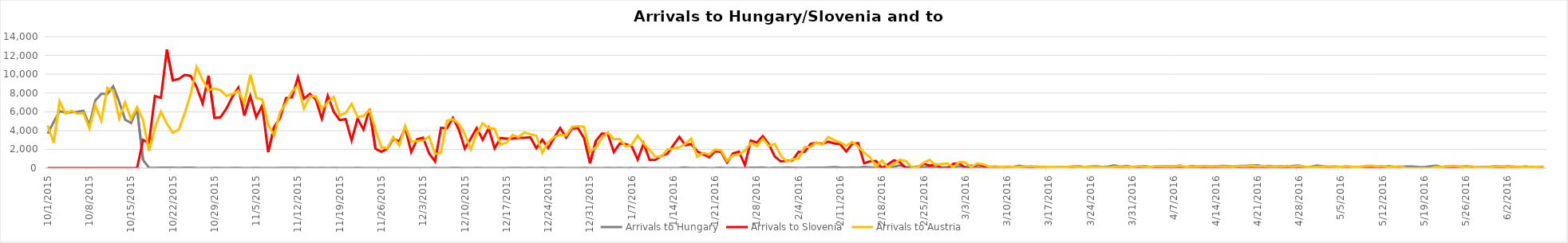
| Category | Arrivals to Hungary | Arrivals to Slovenia | Arrivals to Austria |
|---|---|---|---|
| 10/1/15 | 3667 | 0 | 4550 |
| 10/2/15 | 4897 | 0 | 2700 |
| 10/3/15 | 6056 | 0 | 7100 |
| 10/4/15 | 5925 | 0 | 5800 |
| 10/5/15 | 5952 | 0 | 6100 |
| 10/6/15 | 6000 | 0 | 5800 |
| 10/7/15 | 6103 | 0 | 5861 |
| 10/8/15 | 4583 | 6 | 4229 |
| 10/9/15 | 7215 | 0 | 6700 |
| 10/10/15 | 7907 | 0 | 5050 |
| 10/11/15 | 7897 | 0 | 8540 |
| 10/12/15 | 8702 | 0 | 8240 |
| 10/13/15 | 7081 | 0 | 5280 |
| 10/14/15 | 5157 | 0 | 7000 |
| 10/15/15 | 4808 | 0 | 5235 |
| 10/16/15 | 6353 | 0 | 6500 |
| 10/17/15 | 870 | 3000 | 5155 |
| 10/18/15 | 41 | 2700 | 1822 |
| 10/19/15 | 22 | 7677 | 4300 |
| 10/20/15 | 36 | 7478 | 6017 |
| 10/21/15 | 39 | 12616 | 4737 |
| 10/22/15 | 32 | 9339 | 3767 |
| 10/23/15 | 29 | 9500 | 4092 |
| 10/24/15 | 35 | 9925 | 5841 |
| 10/25/15 | 34 | 9818 | 7882 |
| 10/26/15 | 12 | 8625 | 10784 |
| 10/27/15 | 7 | 6877 | 9390 |
| 10/28/15 | 4 | 9848 | 8336 |
| 10/29/15 | 23 | 5341 | 8473 |
| 10/30/15 | 18 | 5409 | 8302 |
| 10/31/15 | 10 | 6344 | 7691 |
| 11/1/15 | 14 | 7611 | 7887 |
| 11/2/15 | 31 | 8568 | 8243 |
| 11/3/15 | 8 | 5591 | 6900 |
| 11/4/15 | 10 | 7693 | 9930 |
| 11/5/15 | 18 | 5426 | 7478 |
| 11/6/15 | 4 | 6655 | 7315 |
| 11/7/15 | 8 | 1716 | 4648 |
| 11/8/15 | 9 | 4381 | 3465 |
| 11/9/15 | 25 | 5341 | 5962 |
| 11/10/15 | 14 | 7457 | 6933 |
| 11/11/15 | 13 | 7554 | 8169 |
| 11/12/15 | 23 | 9681 | 8777 |
| 11/13/15 | 6 | 7397 | 6351 |
| 11/14/15 | 21 | 7905 | 7659 |
| 11/15/15 | 8 | 7300 | 7632 |
| 11/16/15 | 15 | 5261 | 6319 |
| 11/17/15 | 5 | 7704 | 7026 |
| 11/18/15 | 15 | 5998 | 7577 |
| 11/19/15 | 4 | 5119 | 5635 |
| 11/20/15 | 9 | 5211 | 5865 |
| 11/21/15 | 2 | 2952 | 6836 |
| 11/22/15 | 11 | 5260 | 5446 |
| 11/23/15 | 4 | 4102 | 5546 |
| 11/24/15 | 4 | 6297 | 6204 |
| 11/25/15 | 6 | 2070 | 4122 |
| 11/26/15 | 10 | 1742 | 2211 |
| 11/27/15 | 2 | 2065 | 2120 |
| 11/28/15 | 6 | 3139 | 3320 |
| 11/29/15 | 3 | 2843 | 2407 |
| 11/30/15 | 7 | 4274 | 4482 |
| 12/1/15 | 4 | 1709 | 2821 |
| 12/2/15 | 4 | 3077 | 2874 |
| 12/3/15 | 9 | 3237 | 2935 |
| 12/4/15 | 1 | 1577 | 3366 |
| 12/5/15 | 31 | 715 | 1493 |
| 12/6/15 | 7 | 4288 | 1643 |
| 12/7/15 | 0 | 4240 | 5035 |
| 12/8/15 | 13 | 5351 | 5210 |
| 12/9/15 | 14 | 4103 | 4714 |
| 12/10/15 | 3 | 2078 | 3623 |
| 12/11/15 | 0 | 3149 | 2000 |
| 12/12/15 | 13 | 4271 | 3675 |
| 12/13/15 | 10 | 3016 | 4754 |
| 12/14/15 | 3 | 4250 | 4263 |
| 12/15/15 | 2 | 2098 | 4193 |
| 12/16/15 | 6 | 3214 | 2519 |
| 12/17/15 | 0 | 3135 | 2717 |
| 12/18/15 | 11 | 3150 | 3532 |
| 12/19/15 | 31 | 3222 | 3305 |
| 12/20/15 | 8 | 3233 | 3800 |
| 12/21/15 | 25 | 3278 | 3611 |
| 12/22/15 | 1 | 2118 | 3451 |
| 12/23/15 | 21 | 3030 | 1613 |
| 12/24/15 | 8 | 2131 | 2764 |
| 12/25/15 | 2 | 3257 | 3321 |
| 12/26/15 | 17 | 4274 | 3532 |
| 12/27/15 | 10 | 3253 | 3476 |
| 12/28/15 | 0 | 4228 | 4394 |
| 12/29/15 | 0 | 4239 | 4468 |
| 12/30/15 | 11 | 3195 | 4386 |
| 12/31/15 | 5 | 511 | 1756 |
| 1/1/16 | 0 | 2914 | 2226 |
| 1/2/16 | 0 | 3690 | 3199 |
| 1/3/16 | 17 | 3619 | 3793 |
| 1/4/16 | 3 | 1708 | 3085 |
| 1/5/16 | 18 | 2626 | 3091 |
| 1/6/16 | 5 | 2550 | 2299 |
| 1/7/16 | 31 | 2337 | 2466 |
| 1/8/16 | 7 | 916 | 3472 |
| 1/9/16 | 15 | 2630 | 2619 |
| 1/10/16 | 6 | 880 | 1934 |
| 1/11/16 | 7 | 897 | 1204 |
| 1/12/16 | 2 | 1308 | 1231 |
| 1/13/16 | 5 | 1544 | 1991 |
| 1/14/16 | 4 | 2449 | 2082 |
| 1/15/16 | 14 | 3330 | 2219 |
| 1/16/16 | 65 | 2435 | 2578 |
| 1/17/16 | 11 | 2570 | 3141 |
| 1/18/16 | 9 | 1783 | 1203 |
| 1/19/16 | 29 | 1476 | 1630 |
| 1/20/16 | 10 | 1154 | 1439 |
| 1/21/16 | 13 | 1787 | 1989 |
| 1/22/16 | 47 | 1738 | 1885 |
| 1/23/16 | 10 | 606 | 777 |
| 1/24/16 | 15 | 1564 | 1366 |
| 1/25/16 | 5 | 1746 | 1450 |
| 1/26/16 | 4 | 326 | 1867 |
| 1/27/16 | 36 | 2935 | 2670 |
| 1/28/16 | 51 | 2719 | 2340 |
| 1/29/16 | 69 | 3416 | 3121 |
| 1/30/16 | 6 | 2556 | 2351 |
| 1/31/16 | 39 | 1249 | 2579 |
| 2/1/16 | 31 | 716 | 1367 |
| 2/2/16 | 69 | 765 | 690 |
| 2/3/16 | 46 | 841 | 937 |
| 2/4/16 | 31 | 1733 | 1026 |
| 2/5/16 | 19 | 1713 | 2235 |
| 2/6/16 | 49 | 2580 | 2252 |
| 2/7/16 | 53 | 2694 | 2737 |
| 2/8/16 | 48 | 2582 | 2490 |
| 2/9/16 | 72 | 2805 | 3314 |
| 2/10/16 | 104 | 2637 | 2968 |
| 2/11/16 | 54 | 2547 | 2731 |
| 2/12/16 | 39 | 1774 | 2378 |
| 2/13/16 | 66 | 2576 | 2781 |
| 2/14/16 | 51 | 2660 | 2301 |
| 2/15/16 | 119 | 516 | 1651 |
| 2/16/16 | 93 | 715 | 1143 |
| 2/17/16 | 34 | 769 | 181 |
| 2/18/16 | 73 | 0 | 817 |
| 2/19/16 | 113 | 407 | 50 |
| 2/20/16 | 151 | 828 | 453 |
| 2/21/16 | 288 | 623 | 899 |
| 2/22/16 | 103 | 0 | 744 |
| 2/23/16 | 112 | 0 | 111 |
| 2/24/16 | 166 | 0 | 75 |
| 2/25/16 | 76 | 478 | 583 |
| 2/26/16 | 140 | 254 | 874 |
| 2/27/16 | 111 | 382 | 321 |
| 2/28/16 | 62 | 0 | 447 |
| 2/29/16 | 78 | 0 | 487 |
| 3/1/16 | 83 | 466 | 118 |
| 3/2/16 | 181 | 479 | 644 |
| 3/3/16 | 133 | 0 | 588 |
| 3/4/16 | 268 | 0 | 114 |
| 3/5/16 | 89 | 409 | 500 |
| 3/6/16 | 72 | 253 | 402 |
| 3/7/16 | 100 | 0 | 153 |
| 3/8/16 | 167 | 0 | 171 |
| 3/9/16 | 73 | 0 | 134 |
| 3/10/16 | 70 | 0 | 172 |
| 3/11/16 | 133 | 0 | 132 |
| 3/12/16 | 245 | 0 | 116 |
| 3/13/16 | 148 | 0 | 171 |
| 3/14/16 | 123 | 0 | 211 |
| 3/15/16 | 153 | 0 | 147 |
| 3/16/16 | 104 | 0 | 150 |
| 3/17/16 | 102 | 0 | 129 |
| 3/18/16 | 95 | 0 | 107 |
| 3/19/16 | 132 | 0 | 109 |
| 3/20/16 | 107 | 0 | 126 |
| 3/21/16 | 176 | 0 | 177 |
| 3/22/16 | 188 | 0 | 103 |
| 3/23/16 | 137 | 0 | 127 |
| 3/24/16 | 171 | 0 | 121 |
| 3/25/16 | 199 | 0 | 94 |
| 3/26/16 | 125 | 0 | 104 |
| 3/27/16 | 171 | 6 | 78 |
| 3/28/16 | 293 | 0 | 144 |
| 3/29/16 | 154 | 5 | 170 |
| 3/30/16 | 234 | 4 | 152 |
| 3/31/16 | 127 | 0 | 120 |
| 4/1/16 | 142 | 0 | 210 |
| 4/2/16 | 217 | 0 | 156 |
| 4/3/16 | 119 | 0 | 122 |
| 4/4/16 | 99 | 0 | 221 |
| 4/5/16 | 176 | 2 | 203 |
| 4/6/16 | 191 | 0 | 198 |
| 4/7/16 | 178 | 0 | 196 |
| 4/8/16 | 280 | 0 | 254 |
| 4/9/16 | 83 | 0 | 138 |
| 4/10/16 | 230 | 0 | 171 |
| 4/11/16 | 149 | 0 | 171 |
| 4/12/16 | 214 | 0 | 232 |
| 4/13/16 | 150 | 0 | 193 |
| 4/14/16 | 161 | 0 | 209 |
| 4/15/16 | 237 | 0 | 176 |
| 4/16/16 | 210 | 0 | 175 |
| 4/17/16 | 144 | 0 | 148 |
| 4/18/16 | 229 | 0 | 231 |
| 4/19/16 | 235 | 0 | 183 |
| 4/20/16 | 274 | 0 | 268 |
| 4/21/16 | 294 | 0 | 195 |
| 4/22/16 | 195 | 0 | 227 |
| 4/23/16 | 226 | 0 | 174 |
| 4/24/16 | 151 | 0 | 175 |
| 4/25/16 | 202 | 0 | 191 |
| 4/26/16 | 190 | 0 | 230 |
| 4/27/16 | 241 | 0 | 172 |
| 4/28/16 | 284 | 0 | 232 |
| 4/29/16 | 108 | 0 | 151 |
| 4/30/16 | 141 | 0 | 102 |
| 5/1/16 | 274 | 0 | 136 |
| 5/2/16 | 187 | 0 | 150 |
| 5/3/16 | 131 | 0 | 173 |
| 5/4/16 | 169 | 0 | 141 |
| 5/5/16 | 133 | 0 | 128 |
| 5/6/16 | 178 | 0 | 201 |
| 5/7/16 | 132 | 0 | 129 |
| 5/8/16 | 75 | 0 | 121 |
| 5/9/16 | 124 | 0 | 218 |
| 5/10/16 | 128 | 0 | 260 |
| 5/11/16 | 120 | 0 | 191 |
| 5/12/16 | 89 | 0 | 210 |
| 5/13/16 | 201 | 0 | 120 |
| 5/14/16 | 120 | 0 | 150 |
| 5/15/16 | 139 | 0 | 169 |
| 5/16/16 | 169 | 0 | 0 |
| 5/17/16 | 164 | 0 | 0 |
| 5/18/16 | 121 | 0 | 0 |
| 5/19/16 | 100 | 0 | 0 |
| 5/20/16 | 198 | 0 | 0 |
| 5/21/16 | 245 | 0 | 138 |
| 5/22/16 | 108 | 0 | 122 |
| 5/23/16 | 193 | 0 | 210 |
| 5/24/16 | 198 | 0 | 245 |
| 5/25/16 | 139 | 0 | 156 |
| 5/26/16 | 181 | 0 | 107 |
| 5/27/16 | 144 | 0 | 170 |
| 5/28/16 | 92 | 0 | 79 |
| 5/29/16 | 115 | 0 | 77 |
| 5/30/16 | 140 | 0 | 122 |
| 5/31/16 | 182 | 0 | 177 |
| 6/1/16 | 138 | 0 | 196 |
| 6/2/16 | 187 | 0 | 132 |
| 6/3/16 | 146 | 0 | 167 |
| 6/4/16 | 135 | 0 | 135 |
| 6/5/16 | 164 | 0 | 107 |
| 6/6/16 | 100 | 0 | 140 |
| 6/7/16 | 131 | 0 | 132 |
| 6/8/16 | 104 | 0 | 185 |